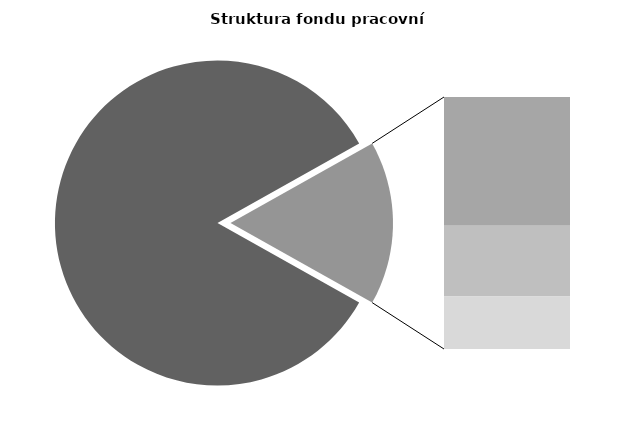
| Category | Series 0 |
|---|---|
| Průměrná měsíční odpracovaná doba bez přesčasu | 142.067 |
| Dovolená | 14.136 |
| Nemoc | 7.764 |
| Jiné | 5.761 |